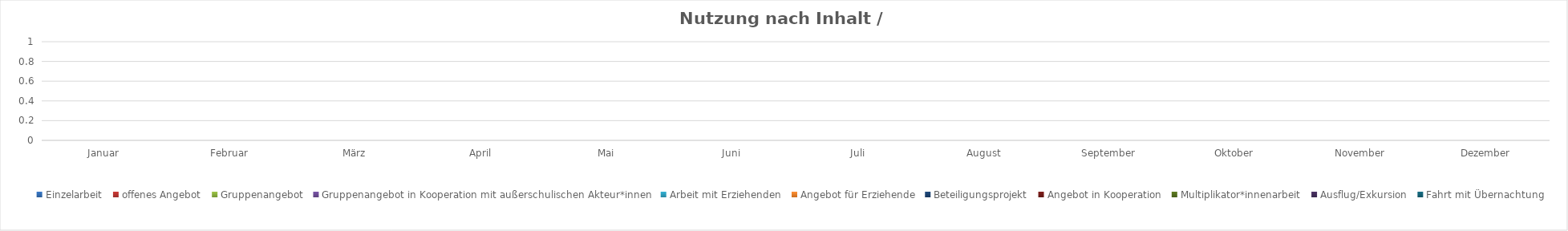
| Category | Einzelarbeit | offenes Angebot | Gruppenangebot | Gruppenangebot in Kooperation mit außerschulischen Akteur*innen | Arbeit mit Erziehenden | Angebot für Erziehende | Beteiligungsprojekt | Angebot in Kooperation | Multiplikator*innenarbeit | Ausflug/Exkursion | Fahrt mit Übernachtung |
|---|---|---|---|---|---|---|---|---|---|---|---|
| Januar | 0 | 0 | 0 | 0 | 0 | 0 | 0 | 0 | 0 | 0 | 0 |
| Februar | 0 | 0 | 0 | 0 | 0 | 0 | 0 | 0 | 0 | 0 | 0 |
| März | 0 | 0 | 0 | 0 | 0 | 0 | 0 | 0 | 0 | 0 | 0 |
| April | 0 | 0 | 0 | 0 | 0 | 0 | 0 | 0 | 0 | 0 | 0 |
| Mai | 0 | 0 | 0 | 0 | 0 | 0 | 0 | 0 | 0 | 0 | 0 |
| Juni | 0 | 0 | 0 | 0 | 0 | 0 | 0 | 0 | 0 | 0 | 0 |
| Juli | 0 | 0 | 0 | 0 | 0 | 0 | 0 | 0 | 0 | 0 | 0 |
| August | 0 | 0 | 0 | 0 | 0 | 0 | 0 | 0 | 0 | 0 | 0 |
| September | 0 | 0 | 0 | 0 | 0 | 0 | 0 | 0 | 0 | 0 | 0 |
| Oktober | 0 | 0 | 0 | 0 | 0 | 0 | 0 | 0 | 0 | 0 | 0 |
| November | 0 | 0 | 0 | 0 | 0 | 0 | 0 | 0 | 0 | 0 | 0 |
| Dezember | 0 | 0 | 0 | 0 | 0 | 0 | 0 | 0 | 0 | 0 | 0 |